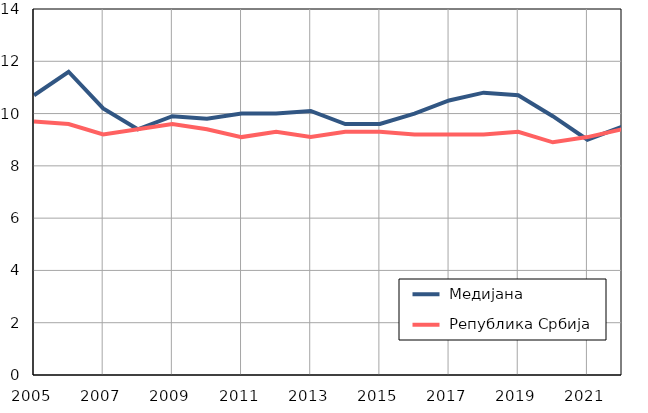
| Category |  Медијана |  Република Србија |
|---|---|---|
| 2005.0 | 10.7 | 9.7 |
| 2006.0 | 11.6 | 9.6 |
| 2007.0 | 10.2 | 9.2 |
| 2008.0 | 9.4 | 9.4 |
| 2009.0 | 9.9 | 9.6 |
| 2010.0 | 9.8 | 9.4 |
| 2011.0 | 10 | 9.1 |
| 2012.0 | 10 | 9.3 |
| 2013.0 | 10.1 | 9.1 |
| 2014.0 | 9.6 | 9.3 |
| 2015.0 | 9.6 | 9.3 |
| 2016.0 | 10 | 9.2 |
| 2017.0 | 10.5 | 9.2 |
| 2018.0 | 10.8 | 9.2 |
| 2019.0 | 10.7 | 9.3 |
| 2020.0 | 9.9 | 8.9 |
| 2021.0 | 9 | 9.1 |
| 2022.0 | 9.5 | 9.4 |